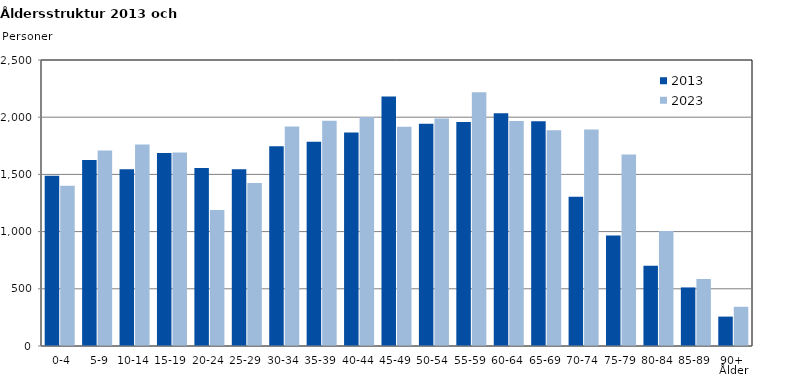
| Category | 2013 | 2023 |
|---|---|---|
|   0-4  | 1488 | 1401 |
|   5-9  | 1625 | 1709 |
| 10-14 | 1545 | 1761 |
| 15-19  | 1687 | 1691 |
| 20-24  | 1557 | 1189 |
| 25-29  | 1546 | 1425 |
| 30-34  | 1745 | 1919 |
| 35-39  | 1786 | 1969 |
| 40-44  | 1866 | 2002 |
| 45-49  | 2180 | 1917 |
| 50-54  | 1943 | 1989 |
| 55-59  | 1958 | 2218 |
| 60-64  | 2035 | 1967 |
| 65-69  | 1965 | 1885 |
| 70-74  | 1305 | 1892 |
| 75-79  | 965 | 1673 |
| 80-84  | 701 | 1006 |
| 85-89  | 512 | 585 |
| 90+ | 257 | 343 |